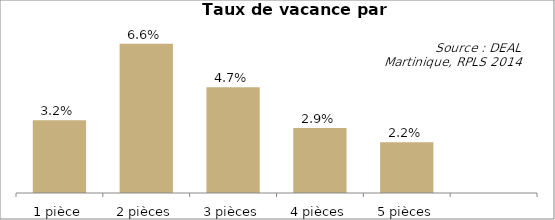
| Category | Series 1 |
|---|---|
| 1 pièce | 0.032 |
| 2 pièces | 0.066 |
| 3 pièces | 0.047 |
| 4 pièces | 0.029 |
| 5 pièces | 0.022 |